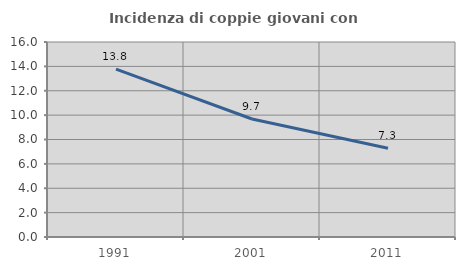
| Category | Incidenza di coppie giovani con figli |
|---|---|
| 1991.0 | 13.78 |
| 2001.0 | 9.684 |
| 2011.0 | 7.279 |